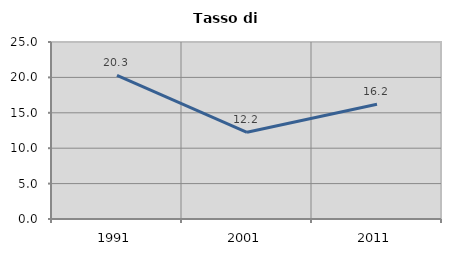
| Category | Tasso di disoccupazione   |
|---|---|
| 1991.0 | 20.301 |
| 2001.0 | 12.245 |
| 2011.0 | 16.201 |